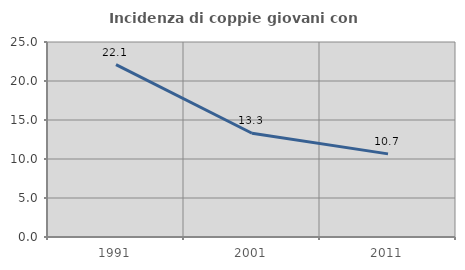
| Category | Incidenza di coppie giovani con figli |
|---|---|
| 1991.0 | 22.1 |
| 2001.0 | 13.302 |
| 2011.0 | 10.656 |